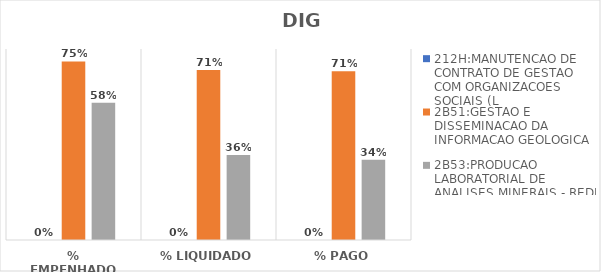
| Category | 212H:MANUTENCAO DE CONTRATO DE GESTAO COM ORGANIZACOES SOCIAIS (L | 2B51:GESTAO E DISSEMINACAO DA INFORMACAO GEOLOGICA | 2B53:PRODUCAO LABORATORIAL DE ANALISES MINERAIS - REDE LAMIN |
|---|---|---|---|
| % EMPENHADO | 0 | 0.748 | 0.575 |
| % LIQUIDADO | 0 | 0.712 | 0.356 |
| % PAGO | 0 | 0.707 | 0.337 |